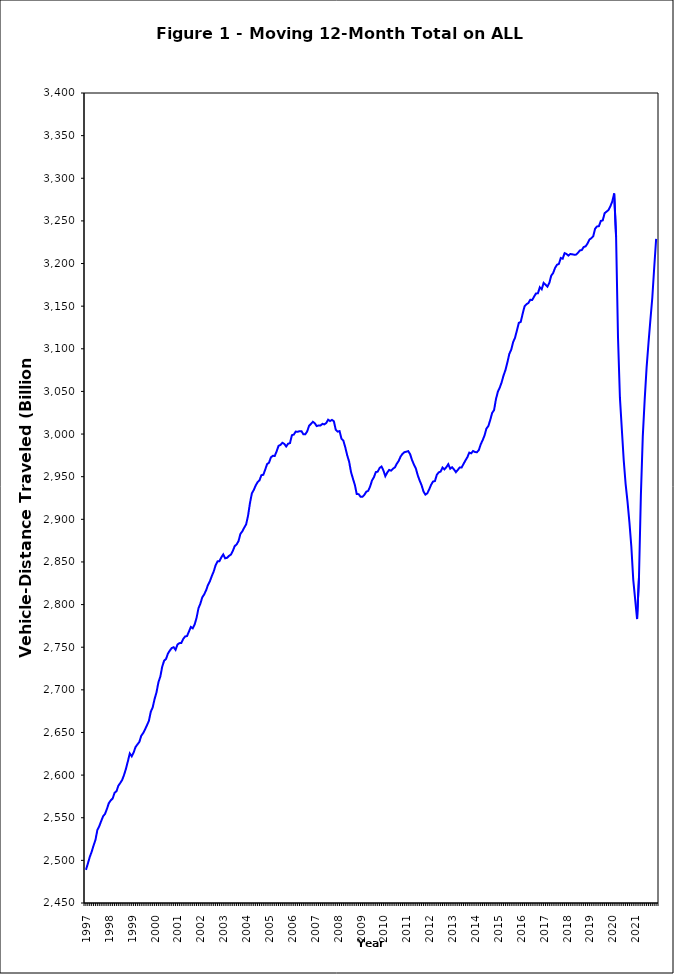
| Category | Annual Vehicle-Distance Traveled (Billion Miles) |
|---|---|
| 1997 | 2488.862 |
| 1997 | 2496.251 |
| 1997 | 2504.031 |
| 1997 | 2510.068 |
| 1997 | 2517.474 |
| 1997 | 2524.178 |
| 1997 | 2535.782 |
| 1997 | 2540.227 |
| 1997 | 2546.17 |
| 1997 | 2551.735 |
| 1997 | 2554.513 |
| 1997 | 2560.373 |
| 1998 | 2567.117 |
| 1998 | 2570.334 |
| 1998 | 2572.603 |
| 1998 | 2579.234 |
| 1998 | 2581.051 |
| 1998 | 2587.529 |
| 1998 | 2590.76 |
| 1998 | 2594.407 |
| 1998 | 2600.322 |
| 1998 | 2607.626 |
| 1998 | 2616.382 |
| 1998 | 2625.363 |
| 1999 | 2622.074 |
| 1999 | 2626.392 |
| 1999 | 2632.934 |
| 1999 | 2636.008 |
| 1999 | 2638.895 |
| 1999 | 2646.133 |
| 1999 | 2649.305 |
| 1999 | 2653.665 |
| 1999 | 2658.51 |
| 1999 | 2663.619 |
| 1999 | 2674.296 |
| 1999 | 2679.459 |
| 2000 | 2689.319 |
| 2000 | 2697.095 |
| 2000 | 2708.822 |
| 2000 | 2715.525 |
| 2000 | 2727.24 |
| 2000 | 2734.232 |
| 2000 | 2736.255 |
| 2000 | 2742.584 |
| 2000 | 2746.178 |
| 2000 | 2749.037 |
| 2000 | 2750.001 |
| 2000 | 2746.926 |
| 2001 | 2753.17 |
| 2001 | 2754.784 |
| 2001 | 2754.882 |
| 2001 | 2759.697 |
| 2001 | 2762.553 |
| 2001 | 2763.088 |
| 2001 | 2768.312 |
| 2001 | 2773.754 |
| 2001 | 2772.166 |
| 2001 | 2776.725 |
| 2001 | 2784.417 |
| 2001 | 2795.611 |
| 2002 | 2801.14 |
| 2002 | 2808.501 |
| 2002 | 2811.984 |
| 2002 | 2816.697 |
| 2002 | 2823.086 |
| 2002 | 2827.457 |
| 2002 | 2833.486 |
| 2002 | 2838.877 |
| 2002 | 2846.19 |
| 2002 | 2850.696 |
| 2002 | 2850.833 |
| 2002 | 2855.509 |
| 2003 | 2858.829 |
| 2003 | 2854.268 |
| 2003 | 2854.878 |
| 2003 | 2857.067 |
| 2003 | 2858.565 |
| 2003 | 2862.841 |
| 2003 | 2868.554 |
| 2003 | 2870.575 |
| 2003 | 2874.402 |
| 2003 | 2882.894 |
| 2003 | 2885.944 |
| 2003 | 2890.222 |
| 2004 | 2894.137 |
| 2004 | 2904.17 |
| 2004 | 2918.894 |
| 2004 | 2930.447 |
| 2004 | 2934.438 |
| 2004 | 2939.676 |
| 2004 | 2943.54 |
| 2004 | 2945.689 |
| 2004 | 2951.752 |
| 2004 | 2952.2 |
| 2004 | 2958.298 |
| 2004 | 2964.789 |
| 2005 | 2966.412 |
| 2005 | 2972.672 |
| 2005 | 2974.451 |
| 2005 | 2974.344 |
| 2005 | 2979.787 |
| 2005 | 2986.22 |
| 2005 | 2987.277 |
| 2005 | 2989.764 |
| 2005 | 2988.489 |
| 2005 | 2985.412 |
| 2005 | 2988.672 |
| 2005 | 2989.43 |
| 2006 | 2998.66 |
| 2006 | 2999.419 |
| 2006 | 3002.882 |
| 2006 | 3002.687 |
| 2006 | 3003.402 |
| 2006 | 3003.39 |
| 2006 | 2999.806 |
| 2006 | 2999.712 |
| 2006 | 3003.097 |
| 2006 | 3009.638 |
| 2006 | 3011.95 |
| 2006 | 3014.371 |
| 2007 | 3012.666 |
| 2007 | 3009.305 |
| 2007 | 3010.146 |
| 2007 | 3009.994 |
| 2007 | 3011.985 |
| 2007 | 3011.338 |
| 2007 | 3012.907 |
| 2007 | 3016.831 |
| 2007 | 3015.25 |
| 2007 | 3016.587 |
| 2007 | 3015.008 |
| 2007 | 3004.968 |
| 2008 | 3002.848 |
| 2008 | 3003.487 |
| 2008 | 2994.509 |
| 2008 | 2992.203 |
| 2008 | 2984.353 |
| 2008 | 2975.013 |
| 2008 | 2967.727 |
| 2008 | 2955.386 |
| 2008 | 2947.698 |
| 2008 | 2940.418 |
| 2008 | 2929.578 |
| 2008 | 2929.532 |
| 2009 | 2926.402 |
| 2009 | 2926.35 |
| 2009 | 2928.722 |
| 2009 | 2932.3 |
| 2009 | 2933.387 |
| 2009 | 2938.416 |
| 2009 | 2945.532 |
| 2009 | 2949.367 |
| 2009 | 2955.386 |
| 2009 | 2955.899 |
| 2009 | 2960.314 |
| 2009 | 2961.896 |
| 2010 | 2957.189 |
| 2010 | 2950.609 |
| 2010 | 2954.928 |
| 2010 | 2957.952 |
| 2010 | 2957.09 |
| 2010 | 2959.366 |
| 2010 | 2960.888 |
| 2010 | 2965.133 |
| 2010 | 2968.548 |
| 2010 | 2973.603 |
| 2010 | 2976.81 |
| 2010 | 2978.703 |
| 2011 | 2979.307 |
| 2011 | 2979.993 |
| 2011 | 2976.315 |
| 2011 | 2969.461 |
| 2011 | 2964.125 |
| 2011 | 2959.594 |
| 2011 | 2951.573 |
| 2011 | 2945.417 |
| 2011 | 2940.042 |
| 2011 | 2932.658 |
| 2011 | 2928.947 |
| 2011 | 2930.524 |
| 2012 | 2935.06 |
| 2012 | 2940.527 |
| 2012 | 2944.275 |
| 2012 | 2944.871 |
| 2012 | 2952.268 |
| 2012 | 2955.054 |
| 2012 | 2956.019 |
| 2012 | 2960.779 |
| 2012 | 2958.6 |
| 2012 | 2961.173 |
| 2012 | 2964.674 |
| 2012 | 2959.345 |
| 2013 | 2961.054 |
| 2013 | 2958.496 |
| 2013 | 2955.327 |
| 2013 | 2957.988 |
| 2013 | 2960.835 |
| 2013 | 2960.711 |
| 2013 | 2965.004 |
| 2013 | 2969.034 |
| 2013 | 2972.76 |
| 2013 | 2978.218 |
| 2013 | 2977.39 |
| 2013 | 2980.089 |
| 2014 | 2978.923 |
| 2014 | 2978.636 |
| 2014 | 2981.182 |
| 2014 | 2987.85 |
| 2014 | 2992.723 |
| 2014 | 2998.289 |
| 2014 | 3006.387 |
| 2014 | 3009.331 |
| 2014 | 3016.446 |
| 2014 | 3024.822 |
| 2014 | 3028.005 |
| 2014 | 3040.953 |
| 2015 | 3049.652 |
| 2015 | 3054.488 |
| 2015 | 3060.785 |
| 2015 | 3068.827 |
| 2015 | 3075.165 |
| 2015 | 3084.025 |
| 2015 | 3093.979 |
| 2015 | 3098.957 |
| 2015 | 3107.877 |
| 2015 | 3112.882 |
| 2015 | 3121.62 |
| 2015 | 3130.46 |
| 2016 | 3131.511 |
| 2016 | 3141.03 |
| 2016 | 3149.798 |
| 2016 | 3152.258 |
| 2016 | 3153.668 |
| 2016 | 3157.484 |
| 2016 | 3157.206 |
| 2016 | 3161.176 |
| 2016 | 3164.936 |
| 2016 | 3165.032 |
| 2016 | 3172.169 |
| 2016 | 3169.797 |
| 2017 | 3177.27 |
| 2017 | 3175.204 |
| 2017 | 3172.822 |
| 2017 | 3177.295 |
| 2017 | 3185.892 |
| 2017 | 3188.865 |
| 2017 | 3194.824 |
| 2017 | 3198.546 |
| 2017 | 3199.51 |
| 2017 | 3206.513 |
| 2017 | 3205.653 |
| 2017 | 3212.206 |
| 2018 | 3211.142 |
| 2018 | 3209.315 |
| 2018 | 3211.216 |
| 2018 | 3210.805 |
| 2018 | 3210.337 |
| 2018 | 3210.451 |
| 2018 | 3212.508 |
| 2018 | 3215.348 |
| 2018 | 3215.804 |
| 2018 | 3219.32 |
| 2018 | 3220.164 |
| 2018 | 3223.357 |
| 2019 | 3228.083 |
| 2019 | 3229.67 |
| 2019 | 3231.897 |
| 2019 | 3240.883 |
| 2019 | 3243.485 |
| 2019 | 3243.837 |
| 2019 | 3250.032 |
| 2019 | 3250.583 |
| 2019 | 3259.099 |
| 2019 | 3260.873 |
| 2019 | 3262.744 |
| 2019 | 3267.122 |
| 2020 | 3272.805 |
| 2020 | 3282.212 |
| 2020 | 3231.458 |
| 2020 | 3113.536 |
| 2020 | 3042.965 |
| 2020 | 3005.929 |
| 2020 | 2969.216 |
| 2020 | 2941.189 |
| 2020 | 2920.424 |
| 2020 | 2896.144 |
| 2020 | 2867.871 |
| 2020 | 2829.003 |
| 2021 | 2806.128 |
| 2021 | 2783.015 |
| 2021 | 2831.798 |
| 2021 | 2928.55 |
| 2021 | 2997.576 |
| 2021 | 3040.593 |
| 2021 | 3078.197 |
| 2021 | 3107.09 |
| 2021 | 3134.143 |
| 2021 | 3160.179 |
| 2021 | 3195.654 |
| 2021 | 3228.836 |